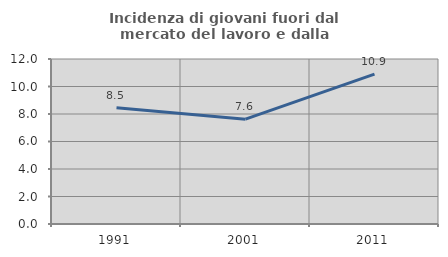
| Category | Incidenza di giovani fuori dal mercato del lavoro e dalla formazione  |
|---|---|
| 1991.0 | 8.46 |
| 2001.0 | 7.625 |
| 2011.0 | 10.9 |